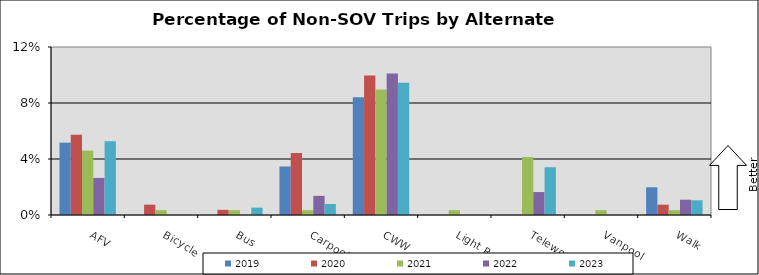
| Category | 2019 | 2020 | 2021 | 2022 | 2023 |
|---|---|---|---|---|---|
| AFV | 0.052 | 0.057 | 0.046 | 0.027 | 0.053 |
| Bicycle | 0 | 0.007 | 0.003 | 0 | 0 |
| Bus | 0 | 0.004 | 0.003 | 0 | 0.005 |
| Carpool | 0.035 | 0.044 | 0.003 | 0.014 | 0.008 |
| CWW | 0.084 | 0.1 | 0.09 | 0.101 | 0.094 |
| Light Rail | 0 | 0 | 0.003 | 0 | 0 |
| Telework | 0 | 0 | 0.041 | 0.016 | 0.034 |
| Vanpool | 0 | 0 | 0.003 | 0 | 0 |
| Walk | 0.02 | 0.007 | 0.003 | 0.011 | 0.01 |